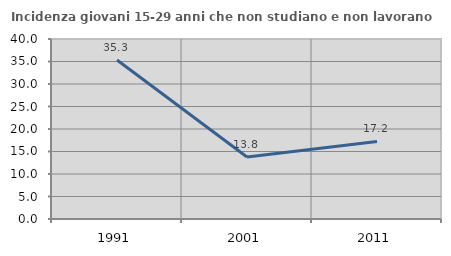
| Category | Incidenza giovani 15-29 anni che non studiano e non lavorano  |
|---|---|
| 1991.0 | 35.327 |
| 2001.0 | 13.789 |
| 2011.0 | 17.239 |